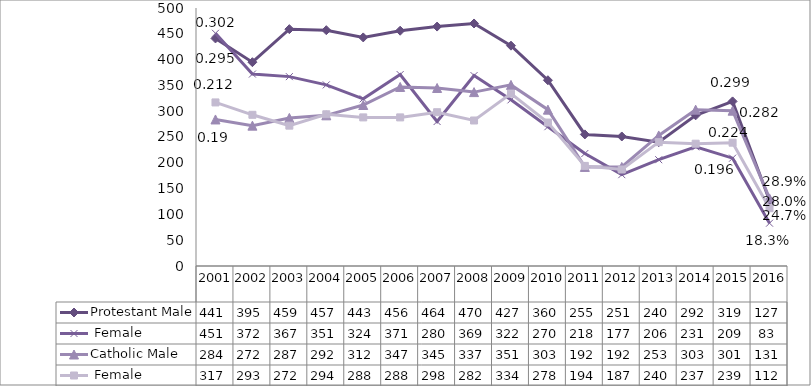
| Category | Protestant | Catholic |
|---|---|---|
| 2001.0 | 451 | 317 |
| 2002.0 | 372 | 293 |
| 2003.0 | 367 | 272 |
| 2004.0 | 351 | 294 |
| 2005.0 | 324 | 288 |
| 2006.0 | 371 | 288 |
| 2007.0 | 280 | 298 |
| 2008.0 | 369 | 282 |
| 2009.0 | 322 | 334 |
| 2010.0 | 270 | 278 |
| 2011.0 | 218 | 194 |
| 2012.0 | 177 | 187 |
| 2013.0 | 206 | 240 |
| 2014.0 | 231 | 237 |
| 2015.0 | 209 | 239 |
| 2016.0 | 83 | 112 |